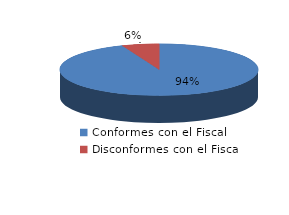
| Category | Series 0 |
|---|---|
| 0 | 2221 |
| 1 | 143 |